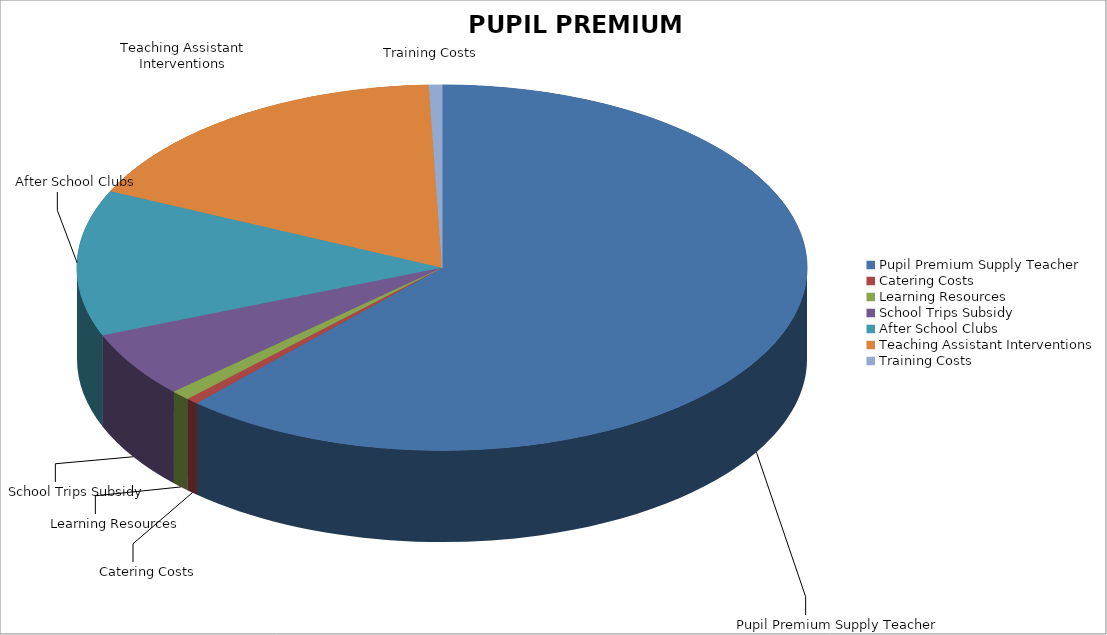
| Category | Series 0 |
|---|---|
| Pupil Premium Supply Teacher | 15847 |
| Catering Costs | 140 |
| Learning Resources | 224 |
| School Trips Subsidy | 1500 |
| After School Clubs | 3315 |
| Teaching Assistant Interventions | 4504 |
| Training Costs | 150 |